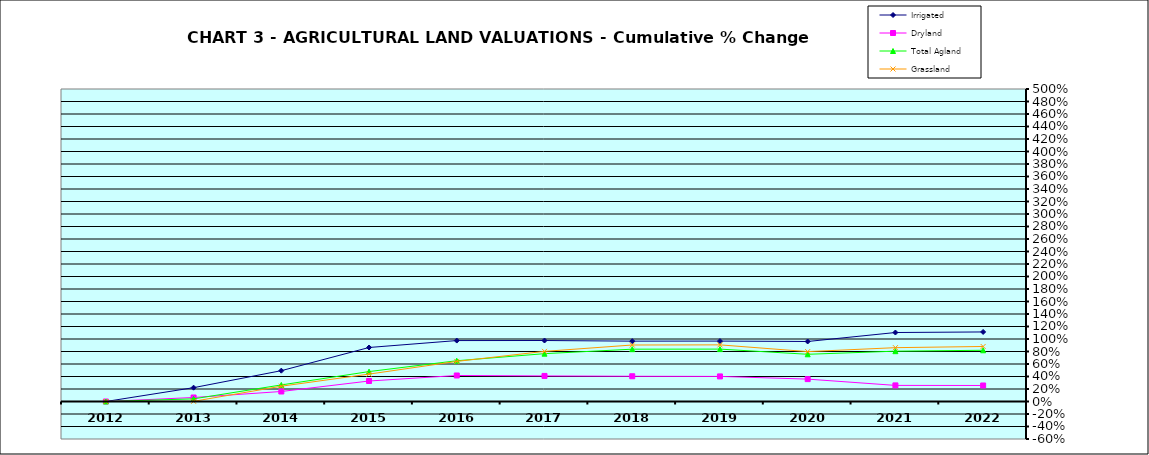
| Category | Irrigated | Dryland | Total Agland | Grassland |
|---|---|---|---|---|
| 2012.0 | 0 | 0 | 0 | 0 |
| 2013.0 | 0.221 | 0.064 | 0.042 | 0.003 |
| 2014.0 | 0.493 | 0.16 | 0.265 | 0.245 |
| 2015.0 | 0.864 | 0.328 | 0.479 | 0.438 |
| 2016.0 | 0.975 | 0.416 | 0.652 | 0.642 |
| 2017.0 | 0.976 | 0.409 | 0.765 | 0.802 |
| 2018.0 | 0.966 | 0.404 | 0.837 | 0.904 |
| 2019.0 | 0.967 | 0.401 | 0.838 | 0.906 |
| 2020.0 | 0.96 | 0.358 | 0.755 | 0.798 |
| 2021.0 | 1.104 | 0.258 | 0.805 | 0.861 |
| 2022.0 | 1.113 | 0.256 | 0.82 | 0.88 |